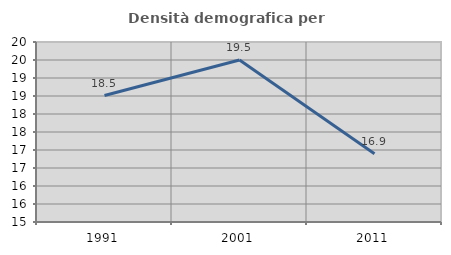
| Category | Densità demografica |
|---|---|
| 1991.0 | 18.513 |
| 2001.0 | 19.498 |
| 2011.0 | 16.898 |